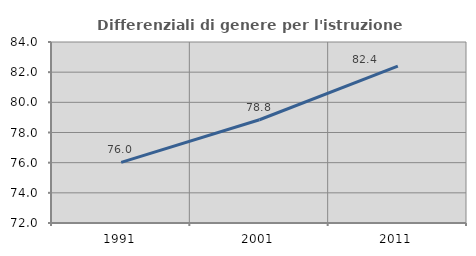
| Category | Differenziali di genere per l'istruzione superiore |
|---|---|
| 1991.0 | 76.016 |
| 2001.0 | 78.846 |
| 2011.0 | 82.402 |